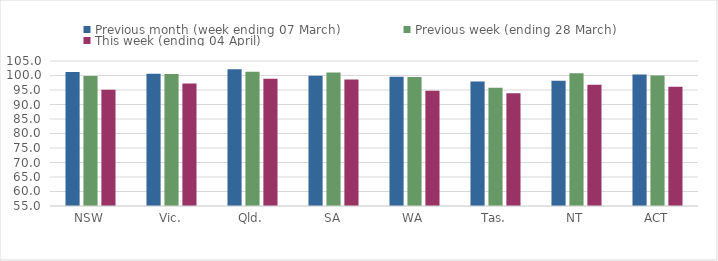
| Category | Previous month (week ending 07 March) | Previous week (ending 28 March) | This week (ending 04 April) |
|---|---|---|---|
| NSW | 101.186 | 99.817 | 95.104 |
| Vic. | 100.572 | 100.544 | 97.203 |
| Qld. | 102.164 | 101.259 | 98.913 |
| SA | 99.933 | 101.028 | 98.582 |
| WA | 99.571 | 99.48 | 94.756 |
| Tas. | 97.898 | 95.764 | 93.885 |
| NT | 98.224 | 100.777 | 96.781 |
| ACT | 100.307 | 100 | 96.128 |